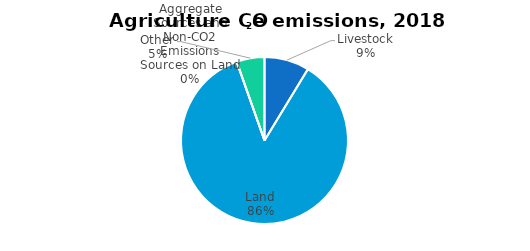
| Category | Series 0 |
|---|---|
| Livestock | 0.01 |
| Land | 0.102 |
| Aggregate Sources and Non-CO2 Emissions Sources on Land | 0 |
| Other | 0.006 |